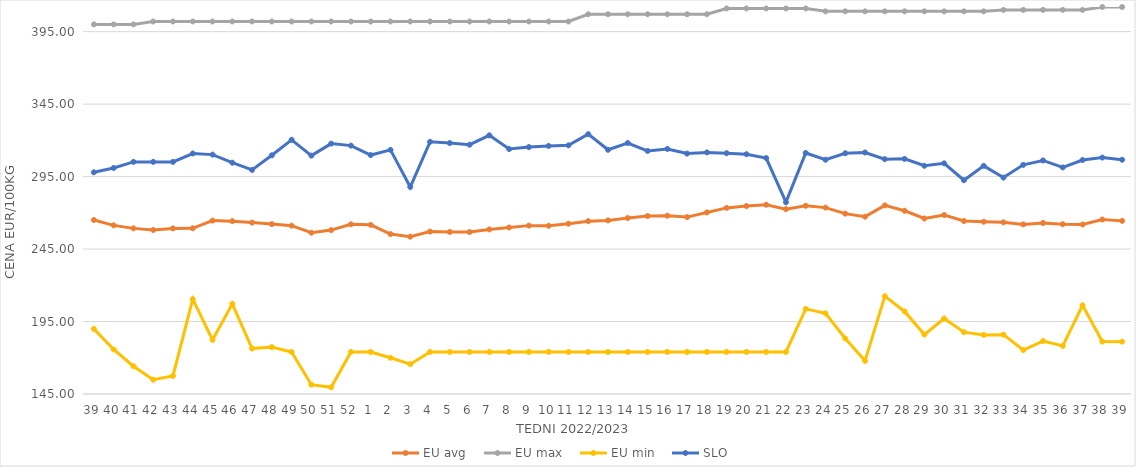
| Category | EU avg | EU max | EU min | SLO |
|---|---|---|---|---|
| 39.0 | 265.059 | 400 | 189.926 | 297.96 |
| 40.0 | 261.35 | 400 | 175.723 | 300.95 |
| 41.0 | 259.271 | 400 | 164.165 | 305.13 |
| 42.0 | 258.146 | 402 | 154.869 | 305.13 |
| 43.0 | 259.256 | 402 | 157.459 | 305.13 |
| 44.0 | 259.32 | 402 | 210.415 | 310.93 |
| 45.0 | 264.649 | 402 | 182.35 | 310.16 |
| 46.0 | 264.228 | 402 | 207.247 | 304.58 |
| 47.0 | 263.24 | 402 | 176.378 | 299.59 |
| 48.0 | 262.225 | 402 | 177.332 | 309.69 |
| 49.0 | 261.152 | 402 | 174 | 320.38 |
| 50.0 | 256.24 | 402 | 151.434 | 309.44 |
| 51.0 | 258.071 | 402 | 149.638 | 317.74 |
| 52.0 | 262.088 | 402 | 174 | 316.36 |
| 1.0 | 261.716 | 402 | 174 | 309.84 |
| 2.0 | 255.331 | 402 | 169.983 | 313.4 |
| 3.0 | 253.546 | 402 | 165.574 | 287.81 |
| 4.0 | 257.051 | 402 | 174 | 318.98 |
| 5.0 | 256.808 | 402 | 174 | 318.13 |
| 6.0 | 256.75 | 402 | 174 | 316.99 |
| 7.0 | 258.565 | 402 | 174 | 323.47 |
| 8.0 | 259.872 | 402 | 174 | 314 |
| 9.0 | 261.164 | 402 | 174 | 315.35 |
| 10.0 | 261.06 | 402 | 174 | 316.13 |
| 11.0 | 262.513 | 402 | 174 | 316.55 |
| 12.0 | 264.228 | 407 | 174 | 324.27 |
| 13.0 | 264.768 | 407 | 174 | 313.49 |
| 14.0 | 266.385 | 407 | 174 | 318.17 |
| 15.0 | 267.797 | 407 | 174 | 312.7 |
| 16.0 | 268.021 | 407 | 174 | 314.07 |
| 17.0 | 267.041 | 407 | 174 | 310.87 |
| 18.0 | 270.255 | 407 | 174 | 311.69 |
| 19.0 | 273.406 | 411 | 174 | 311.13 |
| 20.0 | 274.631 | 411 | 174 | 310.42 |
| 21.0 | 275.561 | 411 | 174 | 307.76 |
| 22.0 | 272.542 | 411 | 174 | 277.34 |
| 23.0 | 274.85 | 411 | 203.728 | 311.28 |
| 24.0 | 273.59 | 409 | 200.686 | 306.64 |
| 25.0 | 269.439 | 409 | 183.275 | 311.1 |
| 26.0 | 267.345 | 409 | 167.858 | 311.62 |
| 27.0 | 275.123 | 409 | 212.506 | 307.04 |
| 28.0 | 271.42 | 409 | 201.945 | 307.23 |
| 29.0 | 266.08 | 409 | 186.018 | 302.45 |
| 30.0 | 268.49 | 409 | 197.093 | 304.14 |
| 31.0 | 264.334 | 409 | 187.684 | 292.49 |
| 32.0 | 263.844 | 409 | 185.774 | 302.41 |
| 33.0 | 263.441 | 410 | 185.951 | 294.3 |
| 34.0 | 262.028 | 410 | 175.332 | 303.1 |
| 35.0 | 262.997 | 410 | 181.543 | 306.13 |
| 36.0 | 262.139 | 410 | 178.207 | 301.32 |
| 37.0 | 261.948 | 410 | 206.146 | 306.4 |
| 38.0 | 265.397 | 412 | 181.159 | 308.12 |
| 39.0 | 264.442 | 412 | 181.124 | 306.62 |